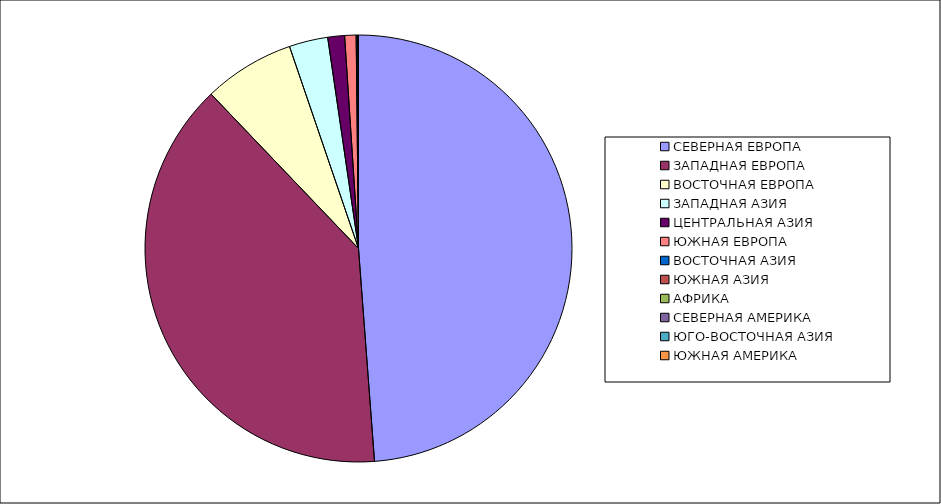
| Category | Оборот |
|---|---|
| СЕВЕРНАЯ ЕВРОПА | 48.803 |
| ЗАПАДНАЯ ЕВРОПА | 39.064 |
| ВОСТОЧНАЯ ЕВРОПА | 6.896 |
| ЗАПАДНАЯ АЗИЯ | 2.928 |
| ЦЕНТРАЛЬНАЯ АЗИЯ | 1.271 |
| ЮЖНАЯ ЕВРОПА | 0.862 |
| ВОСТОЧНАЯ АЗИЯ | 0.122 |
| ЮЖНАЯ АЗИЯ | 0.021 |
| АФРИКА | 0.02 |
| СЕВЕРНАЯ АМЕРИКА | 0.01 |
| ЮГО-ВОСТОЧНАЯ АЗИЯ | 0.002 |
| ЮЖНАЯ АМЕРИКА | 0.001 |